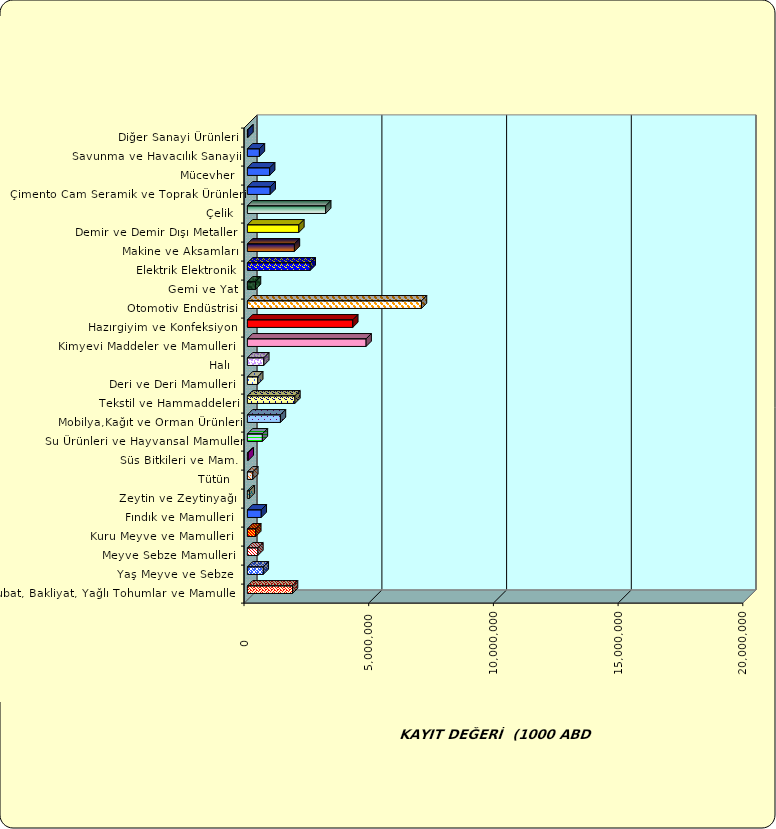
| Category | Series 0 |
|---|---|
|  Hububat, Bakliyat, Yağlı Tohumlar ve Mamulleri  | 1810585.871 |
|  Yaş Meyve ve Sebze   | 637951.224 |
|  Meyve Sebze Mamulleri  | 421298.786 |
|  Kuru Meyve ve Mamulleri   | 337219.023 |
|  Fındık ve Mamulleri  | 557114.885 |
|  Zeytin ve Zeytinyağı  | 78655.45 |
|  Tütün  | 218608.832 |
|  Süs Bitkileri ve Mam. | 36264.008 |
|  Su Ürünleri ve Hayvansal Mamuller | 601962.785 |
|  Mobilya,Kağıt ve Orman Ürünleri | 1326098.635 |
|  Tekstil ve Hammaddeleri | 1906399.235 |
|  Deri ve Deri Mamulleri  | 415260.38 |
|  Halı  | 658717.07 |
|  Kimyevi Maddeler ve Mamulleri   | 4761331.669 |
|  Hazırgiyim ve Konfeksiyon  | 4226637.954 |
|  Otomotiv Endüstrisi | 6980711.829 |
|  Gemi ve Yat | 325549.65 |
|  Elektrik Elektronik | 2520389.997 |
|  Makine ve Aksamları | 1886587.44 |
|  Demir ve Demir Dışı Metaller  | 2064839.637 |
|  Çelik | 3140811.741 |
|  Çimento Cam Seramik ve Toprak Ürünleri | 915057.719 |
|  Mücevher | 894610.296 |
|  Savunma ve Havacılık Sanayii | 482676.239 |
|  Diğer Sanayi Ürünleri | 22746.498 |